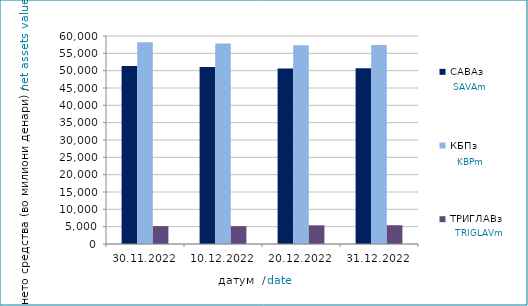
| Category | САВАз | КБПз | ТРИГЛАВз |
|---|---|---|---|
| 2022-11-30 | 51377.458 | 58198.193 | 5164.903 |
| 2022-12-10 | 51073.486 | 57804.357 | 5143.337 |
| 2022-12-20 | 50650.87 | 57363.442 | 5388.376 |
| 2022-12-31 | 50715.461 | 57418.836 | 5407.762 |